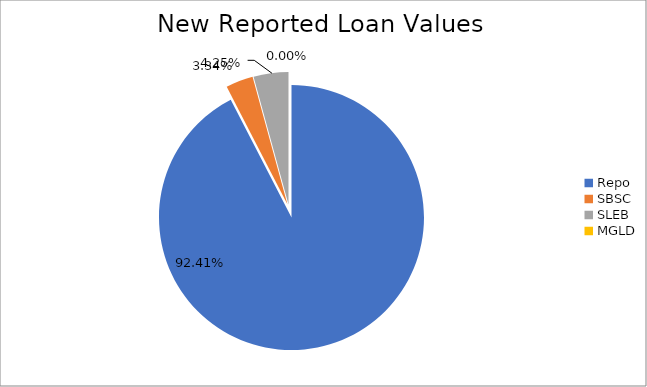
| Category | Series 0 |
|---|---|
| Repo | 8598769.658 |
| SBSC | 310545.269 |
| SLEB | 395165.303 |
| MGLD | 46.987 |